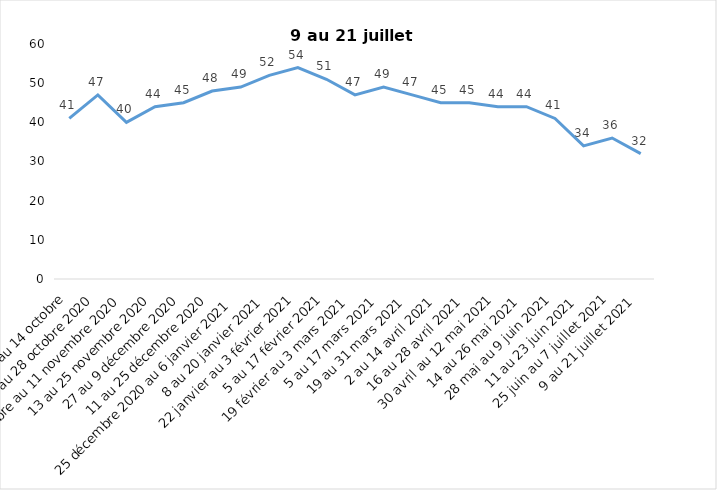
| Category | Toujours aux trois mesures |
|---|---|
| 2 au 14 octobre | 41 |
| 16 au 28 octobre 2020 | 47 |
| 30 octobre au 11 novembre 2020 | 40 |
| 13 au 25 novembre 2020 | 44 |
| 27 au 9 décembre 2020 | 45 |
| 11 au 25 décembre 2020 | 48 |
| 25 décembre 2020 au 6 janvier 2021 | 49 |
| 8 au 20 janvier 2021 | 52 |
| 22 janvier au 3 février 2021 | 54 |
| 5 au 17 février 2021 | 51 |
| 19 février au 3 mars 2021 | 47 |
| 5 au 17 mars 2021 | 49 |
| 19 au 31 mars 2021 | 47 |
| 2 au 14 avril 2021 | 45 |
| 16 au 28 avril 2021 | 45 |
| 30 avril au 12 mai 2021 | 44 |
| 14 au 26 mai 2021 | 44 |
| 28 mai au 9 juin 2021 | 41 |
| 11 au 23 juin 2021 | 34 |
| 25 juin au 7 juillet 2021 | 36 |
| 9 au 21 juillet 2021 | 32 |